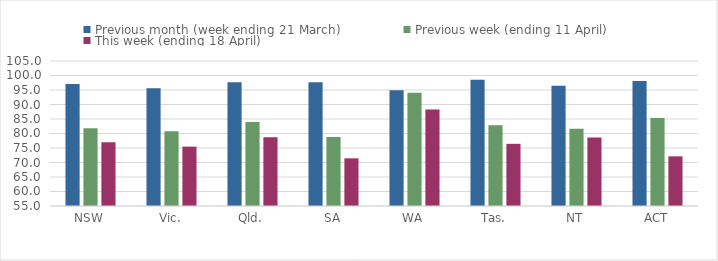
| Category | Previous month (week ending 21 March) | Previous week (ending 11 April) | This week (ending 18 April) |
|---|---|---|---|
| NSW | 97.038 | 81.846 | 76.979 |
| Vic. | 95.595 | 80.806 | 75.471 |
| Qld. | 97.661 | 83.973 | 78.717 |
| SA | 97.685 | 78.753 | 71.43 |
| WA | 94.907 | 94.073 | 88.269 |
| Tas. | 98.539 | 82.811 | 76.442 |
| NT | 96.429 | 81.618 | 78.648 |
| ACT | 98.131 | 85.381 | 72.121 |